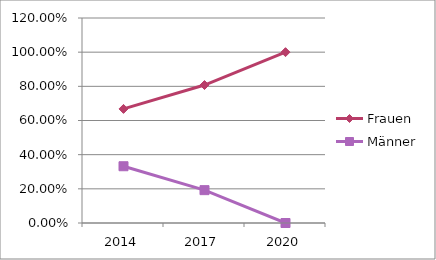
| Category | Frauen | Männer |
|---|---|---|
| 2014.0 | 0.668 | 0.332 |
| 2017.0 | 0.808 | 0.192 |
| 2020.0 | 1 | 0 |